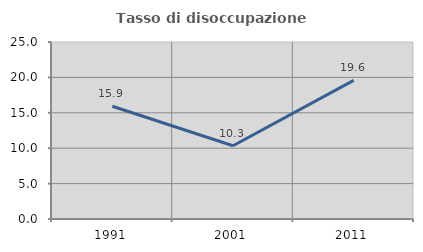
| Category | Tasso di disoccupazione giovanile  |
|---|---|
| 1991.0 | 15.929 |
| 2001.0 | 10.345 |
| 2011.0 | 19.588 |